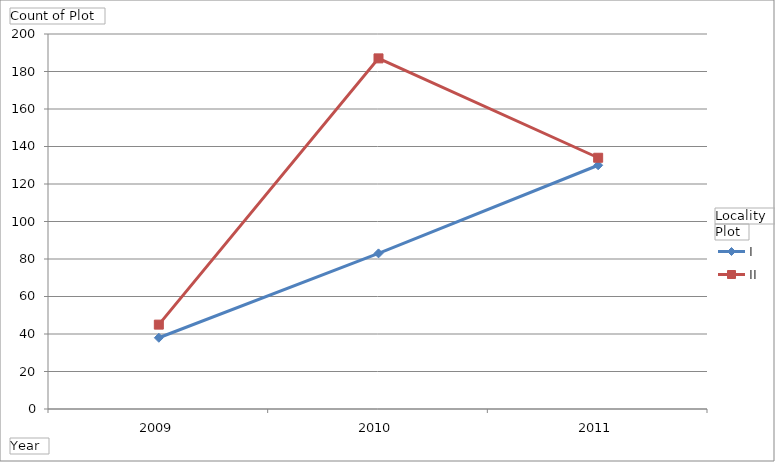
| Category | Manheim - I | Manheim - II |
|---|---|---|
| 2009 | 38 | 45 |
| 2010 | 83 | 187 |
| 2011 | 130 | 134 |